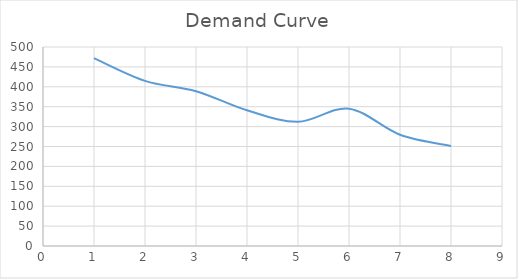
| Category | Demand Curve |
|---|---|
| 0 | 472 |
| 1 | 415 |
| 2 | 389 |
| 3 | 341 |
| 4 | 312 |
| 5 | 345 |
| 6 | 279.6 |
| 7 | 251.257 |